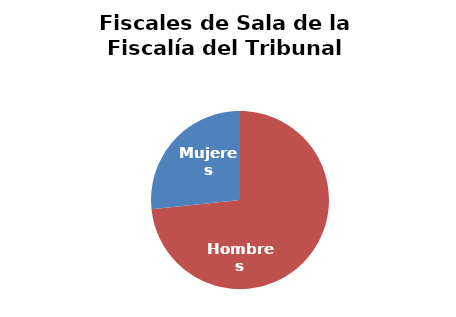
| Category | Fiscales de Sala de la Fiscalía del Tribunal Supremo |
|---|---|
| Hombres | 11 |
| Mujeres | 4 |